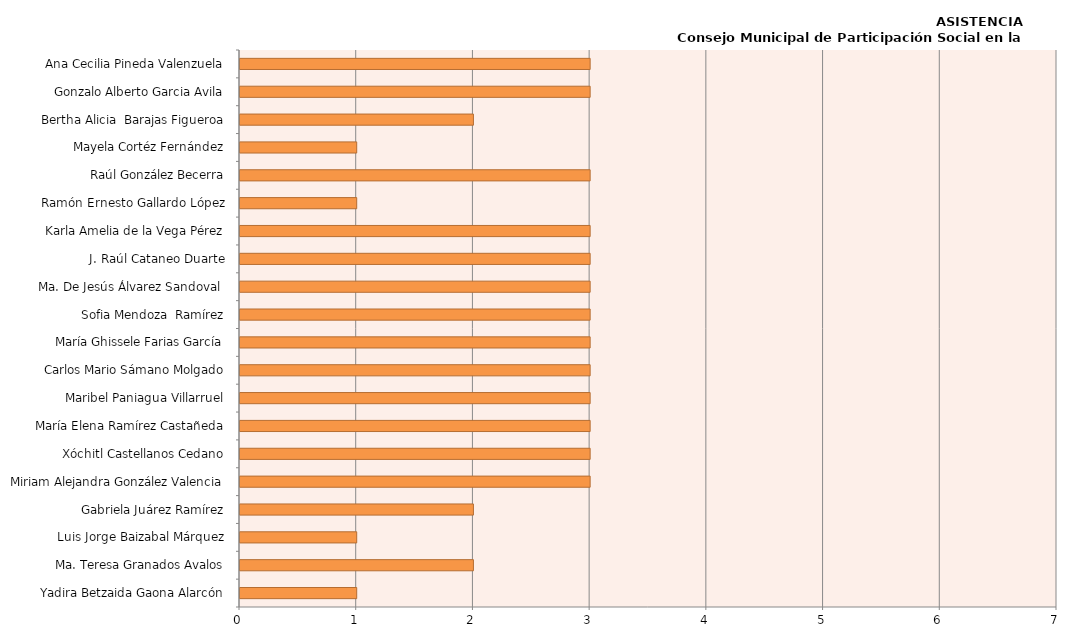
| Category | Series 0 |
|---|---|
| Yadira Betzaida Gaona Alarcón | 1 |
| Ma. Teresa Granados Avalos | 2 |
| Luis Jorge Baizabal Márquez | 1 |
| Gabriela Juárez Ramírez | 2 |
| Miriam Alejandra González Valencia | 3 |
| Xóchitl Castellanos Cedano | 3 |
| María Elena Ramírez Castañeda | 3 |
| Maribel Paniagua Villarruel | 3 |
| Carlos Mario Sámano Molgado | 3 |
| María Ghissele Farias García | 3 |
| Sofia Mendoza  Ramírez | 3 |
| Ma. De Jesús Álvarez Sandoval  | 3 |
|  J. Raúl Cataneo Duarte | 3 |
|  Karla Amelia de la Vega Pérez | 3 |
| Ramón Ernesto Gallardo López | 1 |
| Raúl González Becerra | 3 |
| Mayela Cortéz Fernández | 1 |
| Bertha Alicia  Barajas Figueroa | 2 |
| Gonzalo Alberto Garcia Avila | 3 |
| Ana Cecilia Pineda Valenzuela | 3 |